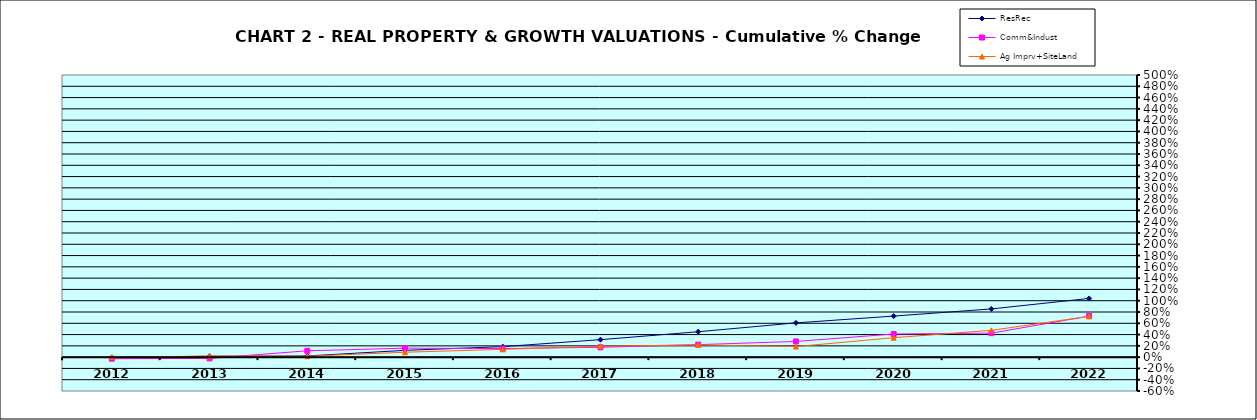
| Category | ResRec | Comm&Indust | Ag Imprv+SiteLand |
|---|---|---|---|
| 2012.0 | -0.006 | -0.028 | 0 |
| 2013.0 | 0.017 | -0.022 | 0.018 |
| 2014.0 | 0.021 | 0.112 | 0.016 |
| 2015.0 | 0.12 | 0.159 | 0.087 |
| 2016.0 | 0.186 | 0.152 | 0.139 |
| 2017.0 | 0.31 | 0.175 | 0.193 |
| 2018.0 | 0.45 | 0.222 | 0.217 |
| 2019.0 | 0.607 | 0.278 | 0.187 |
| 2020.0 | 0.728 | 0.41 | 0.344 |
| 2021.0 | 0.854 | 0.425 | 0.475 |
| 2022.0 | 1.04 | 0.728 | 0.723 |